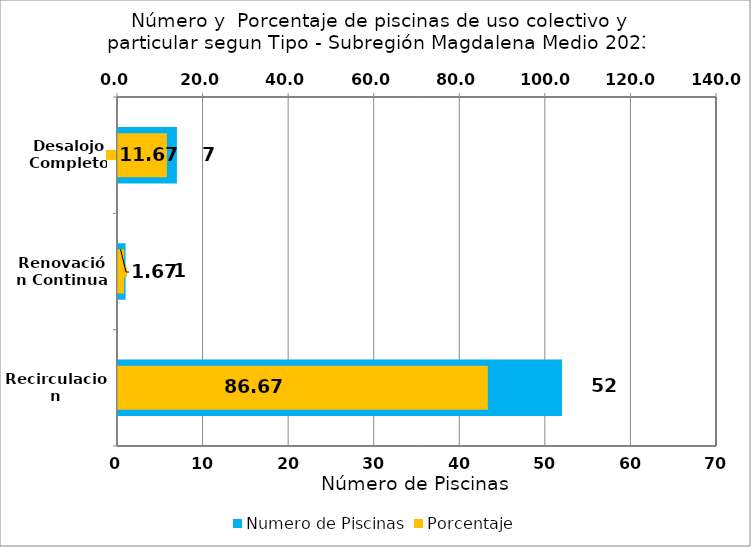
| Category | Numero de Piscinas |
|---|---|
| Recirculacion | 52 |
| Renovación Continua | 1 |
| Desalojo Completo | 7 |